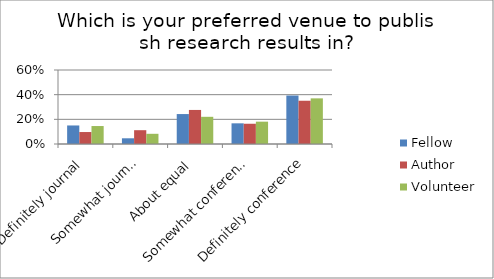
| Category | Fellow | Author | Volunteer |
|---|---|---|---|
| Definitely journal | 0.15 | 0.097 | 0.146 |
| Somewhat journal | 0.046 | 0.112 | 0.083 |
| About equal | 0.243 | 0.276 | 0.22 |
| Somewhat conference | 0.168 | 0.164 | 0.181 |
| Definitely conference | 0.393 | 0.351 | 0.37 |